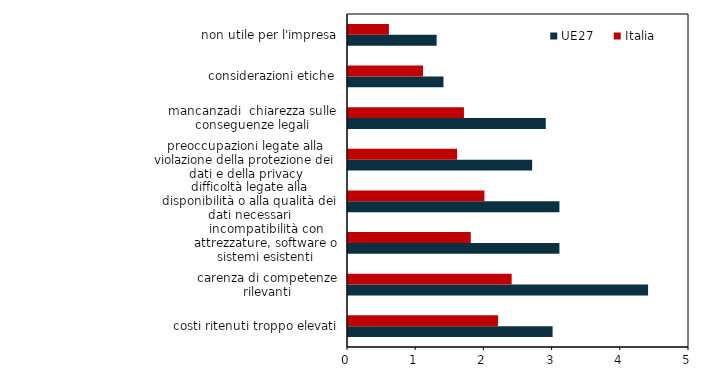
| Category | UE27 | Italia |
|---|---|---|
| costi ritenuti troppo elevati | 3 | 2.2 |
| carenza di competenze rilevanti | 4.4 | 2.4 |
| incompatibilità con attrezzature, software o sistemi esistenti | 3.1 | 1.8 |
| difficoltà legate alla disponibilità o alla qualità dei dati necessari | 3.1 | 2 |
| preoccupazioni legate alla violazione della protezione dei dati e della privacy | 2.7 | 1.6 |
| mancanzadi  chiarezza sulle conseguenze legali | 2.9 | 1.7 |
| considerazioni etiche | 1.4 | 1.1 |
| non utile per l'impresa | 1.3 | 0.6 |